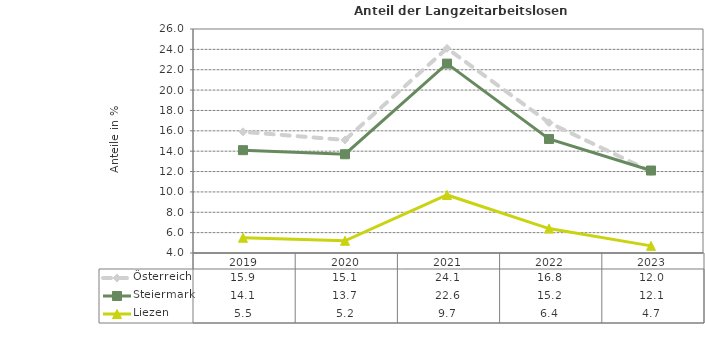
| Category | Österreich | Steiermark | Liezen |
|---|---|---|---|
| 2023.0 | 12 | 12.1 | 4.7 |
| 2022.0 | 16.8 | 15.2 | 6.4 |
| 2021.0 | 24.1 | 22.6 | 9.7 |
| 2020.0 | 15.1 | 13.7 | 5.2 |
| 2019.0 | 15.9 | 14.1 | 5.5 |